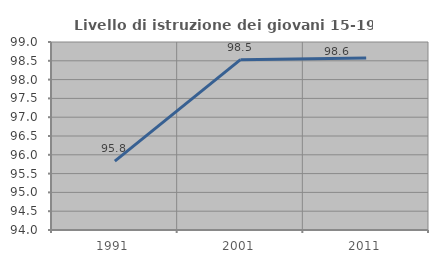
| Category | Livello di istruzione dei giovani 15-19 anni |
|---|---|
| 1991.0 | 95.833 |
| 2001.0 | 98.529 |
| 2011.0 | 98.571 |